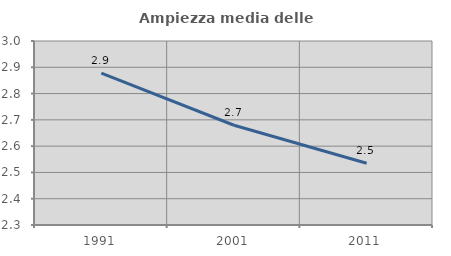
| Category | Ampiezza media delle famiglie |
|---|---|
| 1991.0 | 2.878 |
| 2001.0 | 2.68 |
| 2011.0 | 2.535 |